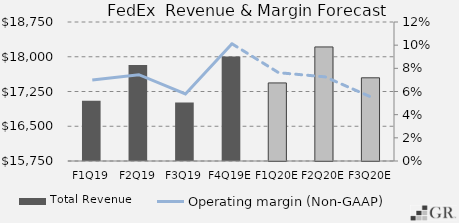
| Category | Total Revenue |
|---|---|
|  F1Q19  | 17052 |
|  F2Q19  | 17824 |
|  F3Q19  | 17010 |
|  F4Q19E  | 18006.082 |
|  F1Q20E  | 17434.828 |
|  F2Q20E  | 18211.574 |
|  F3Q20E  | 17545.56 |